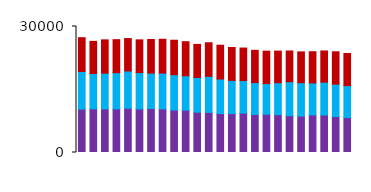
| Category | Item1 |
|---|---|
| 0 | 8044 |
| 1 | 7650 |
| 2 | 7935 |
| 3 | 7863 |
| 4 | 7714 |
| 5 | 7783 |
| 6 | 7996 |
| 7 | 8058 |
| 8 | 8206 |
| 9 | 8129 |
| 10 | 7866 |
| 11 | 7994 |
| 12 | 8040 |
| 13 | 7824 |
| 14 | 7742 |
| 15 | 7667 |
| 16 | 7721 |
| 17 | 7524 |
| 18 | 7319 |
| 19 | 7336 |
| 20 | 7438 |
| 21 | 7429 |
| 22 | 7706 |
| 23 | 7646 |